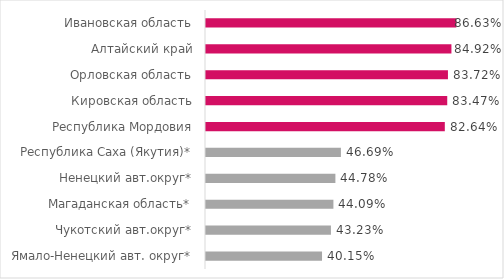
| Category | Замещающий коэффициэнт, (%) |
|---|---|
| Ямало-Ненецкий авт. округ* | 0.401 |
| Чукотский авт.округ* | 0.432 |
| Магаданская область* | 0.441 |
| Ненецкий авт.округ* | 0.448 |
| Республика Саха (Якутия)* | 0.467 |
| Республика Мордовия | 0.826 |
| Кировская область | 0.835 |
| Орловская область | 0.837 |
| Алтайский край | 0.849 |
| Ивановская область | 0.866 |